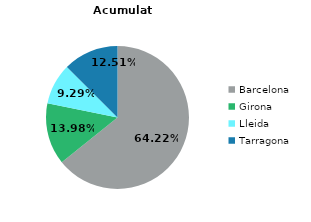
| Category | Acumulat any actual |
|---|---|
| Barcelona | 42168 |
| Girona | 9177 |
| Lleida | 6101 |
| Tarragona | 8212 |